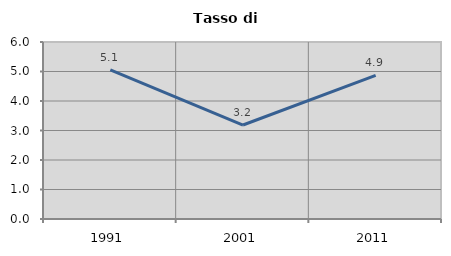
| Category | Tasso di disoccupazione   |
|---|---|
| 1991.0 | 5.054 |
| 2001.0 | 3.186 |
| 2011.0 | 4.87 |